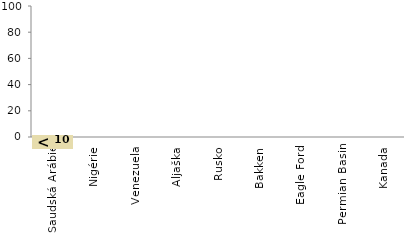
| Category | Series 0 |
|---|---|
| Saudská Arábie | 0 |
| Nigérie | 0 |
| Venezuela | 0 |
| Aljaška | 0 |
| Rusko | 0 |
| Bakken | 0 |
| Eagle Ford | 0 |
| Permian Basin | 0 |
| Kanada | 0 |